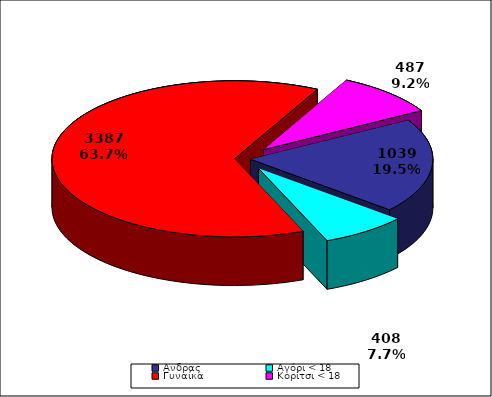
| Category | ΣΥΝΟΛΟ |
|---|---|
| Aνδρας | 1039 |
| Αγόρι < 18 | 408 |
| Γυναίκα | 3387 |
| Κορίτσι < 18 | 487 |